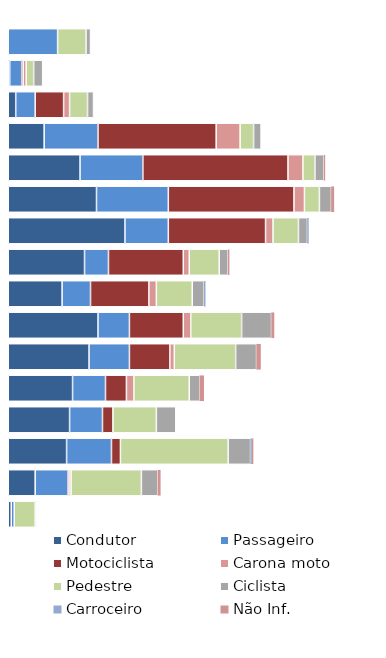
| Category | Condutor | Passageiro | Motociclista | Carona moto | Pedestre | Ciclista | Carroceiro | Não Inf. |
|---|---|---|---|---|---|---|---|---|
| 0-10 | 0 | 33 | 0 | 0 | 19 | 3 | 0 | 0 |
| 11-14 | 1 | 8 | 1 | 2 | 5 | 6 | 0 | 0 |
| 15-17 | 5 | 13 | 19 | 4 | 12 | 4 | 0 | 0 |
| 18-20 | 24 | 36 | 79 | 16 | 9 | 5 | 0 | 0 |
| 21-24 | 48 | 42 | 97 | 10 | 8 | 6 | 0 | 1 |
| 25-29 | 59 | 48 | 84 | 7 | 10 | 8 | 0 | 2 |
| 30-34 | 78 | 29 | 65 | 5 | 17 | 6 | 1 | 0 |
| 35-39 | 51 | 16 | 50 | 4 | 20 | 6 | 0 | 1 |
| 40-44 | 36 | 19 | 39 | 5 | 24 | 8 | 1 | 0 |
| 45-49 | 60 | 21 | 36 | 5 | 34 | 20 | 0 | 2 |
| 50-54 | 54 | 27 | 27 | 3 | 41 | 14 | 0 | 3 |
| 55-59 | 43 | 22 | 14 | 5 | 37 | 7 | 0 | 3 |
| 60-64 | 41 | 22 | 7 | 0 | 29 | 13 | 0 | 0 |
| 65-74 | 39 | 30 | 6 | 0 | 72 | 15 | 1 | 1 |
| 75+ | 18 | 22 | 1 | 1 | 47 | 11 | 0 | 2 |
| NI | 2 | 2 | 0 | 0 | 14 | 1 | 0 | 0 |